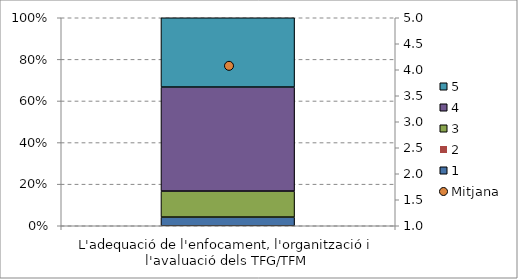
| Category | 1 | 2 | 3 | 4 | 5 |
|---|---|---|---|---|---|
| L'adequació de l'enfocament, l'organització i l'avaluació dels TFG/TFM | 0.042 | 0 | 0.125 | 0.5 | 0.333 |